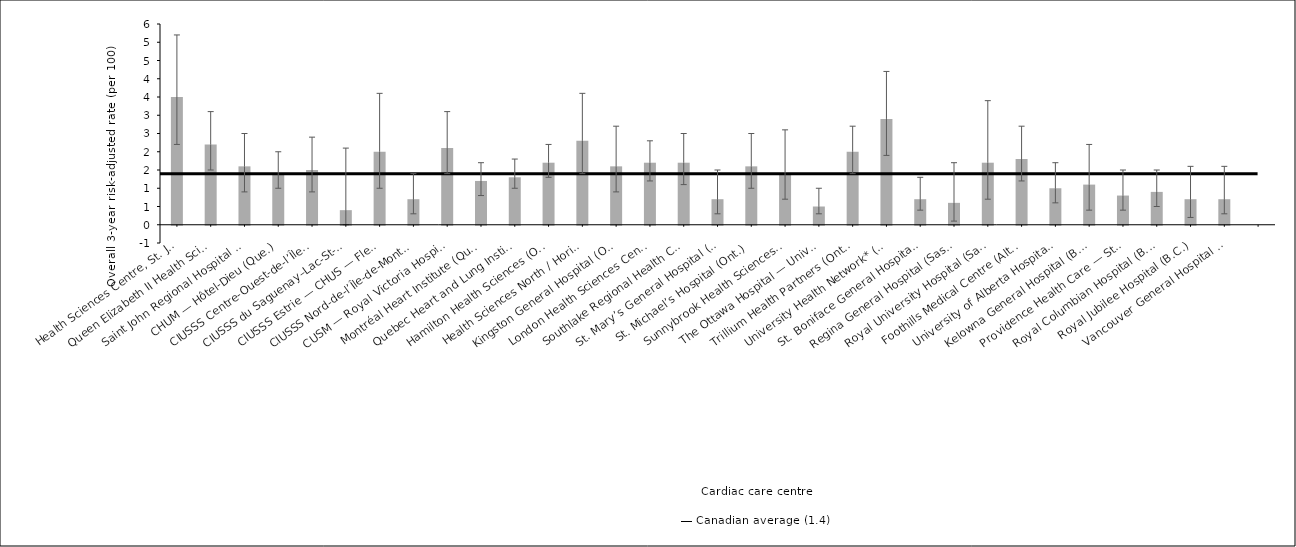
| Category | Risk-adjusted rate |
|---|---|
| Health Sciences Centre, St. John’s* (N.L.) | 3.5 |
| Queen Elizabeth II Health Sciences Centre* (N.S.) | 2.2 |
| Saint John Regional Hospital (N.B.) | 1.6 |
| CHUM — Hôtel-Dieu (Que.) | 1.4 |
| CIUSSS Centre-Ouest-de-l’Île-de-Montréal — Jewish General Hospital (Que.) | 1.5 |
| CIUSSS du Saguenay–Lac-St-Jean — Chicoutimi Hospital (Que.) | 0.4 |
| CIUSSS Estrie — CHUS — Fleurimont Hospital (Que.) | 2 |
| CIUSSS Nord-de-l’Île-de-Montréal — Montréal Sacré-Coeur Hospital (Que.) | 0.7 |
| CUSM — Royal Victoria Hospital (Que.) | 2.1 |
| Montréal Heart Institute (Que.) | 1.2 |
| Quebec Heart and Lung Institute (Que.) | 1.3 |
| Hamilton Health Sciences (Ont.) | 1.7 |
| Health Sciences North / Horizon Santé-Nord (Ont.) | 2.3 |
| Kingston General Hospital (Ont.) | 1.6 |
| London Health Sciences Centre (Ont.) | 1.7 |
| Southlake Regional Health Centre (Ont.) | 1.7 |
| St. Mary’s General Hospital (Ont.) | 0.7 |
| St. Michael’s Hospital (Ont.) | 1.6 |
| Sunnybrook Health Sciences Centre (Ont.) | 1.4 |
| The Ottawa Hospital — University of Ottawa Heart Institute* (Ont.) | 0.5 |
| Trillium Health Partners (Ont.) | 2 |
| University Health Network* (Ont.) | 2.9 |
| St. Boniface General Hospital* (Man.) | 0.7 |
| Regina General Hospital (Sask.) | 0.6 |
| Royal University Hospital (Sask.) | 1.7 |
| Foothills Medical Centre (Alta.) | 1.8 |
| University of Alberta Hospital (Alta.) | 1 |
| Kelowna General Hospital (B.C.) | 1.1 |
| Providence Health Care — St. Paul’s Hospital (Vancouver) (B.C.) | 0.8 |
| Royal Columbian Hospital (B.C.) | 0.9 |
| Royal Jubilee Hospital (B.C.) | 0.7 |
| Vancouver General Hospital (B.C.) | 0.7 |